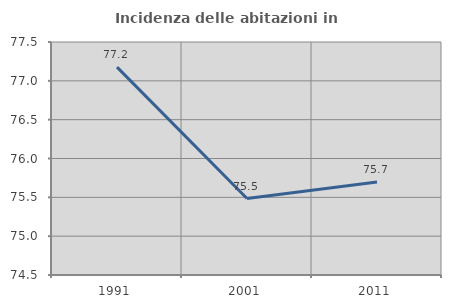
| Category | Incidenza delle abitazioni in proprietà  |
|---|---|
| 1991.0 | 77.177 |
| 2001.0 | 75.484 |
| 2011.0 | 75.698 |